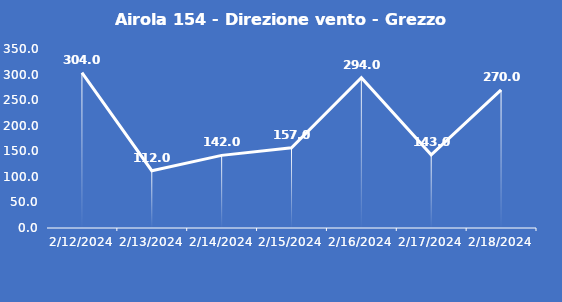
| Category | Airola 154 - Direzione vento - Grezzo (°N) |
|---|---|
| 2/12/24 | 304 |
| 2/13/24 | 112 |
| 2/14/24 | 142 |
| 2/15/24 | 157 |
| 2/16/24 | 294 |
| 2/17/24 | 143 |
| 2/18/24 | 270 |